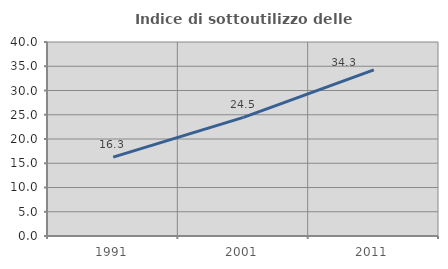
| Category | Indice di sottoutilizzo delle abitazioni  |
|---|---|
| 1991.0 | 16.252 |
| 2001.0 | 24.471 |
| 2011.0 | 34.262 |